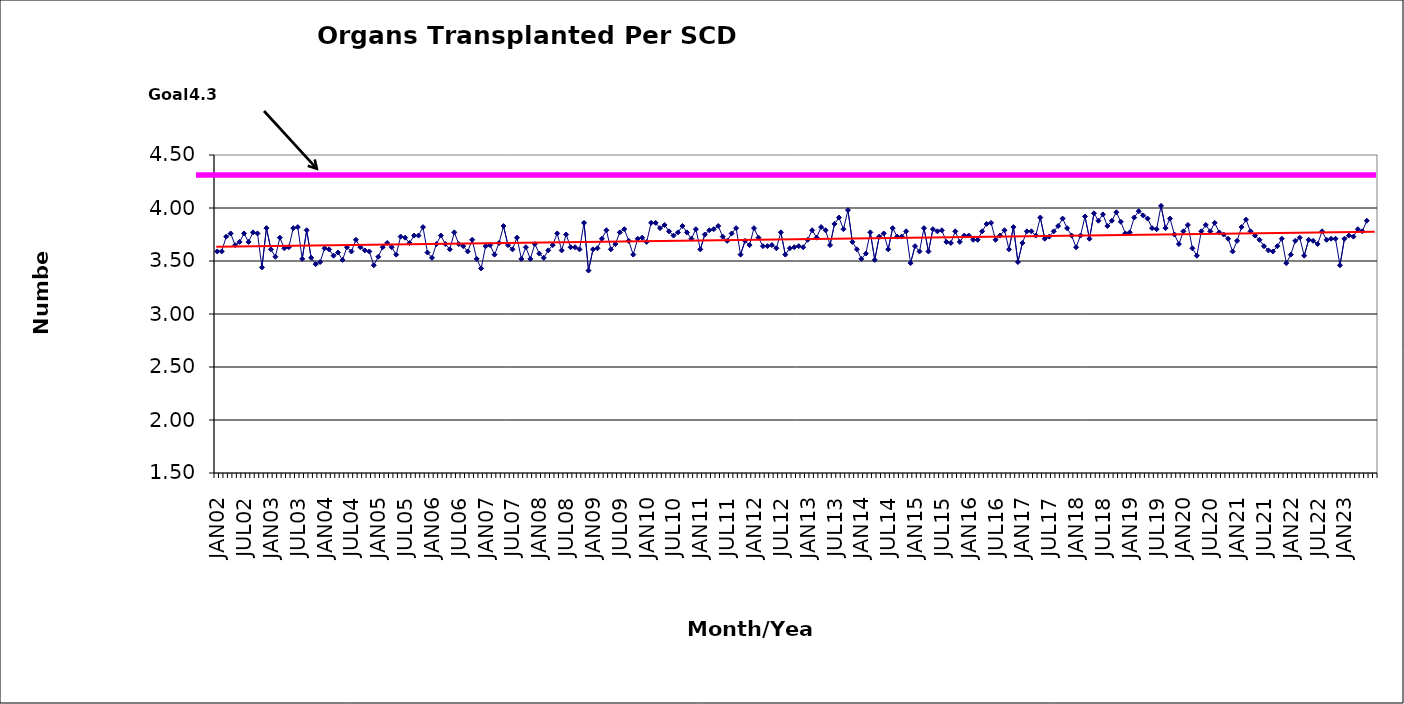
| Category | Series 0 |
|---|---|
| JAN02 | 3.59 |
| FEB02 | 3.59 |
| MAR02 | 3.73 |
| APR02 | 3.76 |
| MAY02 | 3.65 |
| JUN02 | 3.68 |
| JUL02 | 3.76 |
| AUG02 | 3.68 |
| SEP02 | 3.77 |
| OCT02 | 3.76 |
| NOV02 | 3.44 |
| DEC02 | 3.81 |
| JAN03 | 3.61 |
| FEB03 | 3.54 |
| MAR03 | 3.72 |
| APR03 | 3.62 |
| MAY03 | 3.63 |
| JUN03 | 3.81 |
| JUL03 | 3.82 |
| AUG03 | 3.52 |
| SEP03 | 3.79 |
| OCT03 | 3.53 |
| NOV03 | 3.47 |
| DEC03 | 3.49 |
| JAN04 | 3.62 |
| FEB04 | 3.61 |
| MAR04 | 3.55 |
| APR04 | 3.58 |
| MAY04 | 3.51 |
| JUN04 | 3.63 |
| JUL04 | 3.59 |
| AUG04 | 3.7 |
| SEP04 | 3.63 |
| OCT04 | 3.6 |
| NOV04 | 3.59 |
| DEC04 | 3.46 |
| JAN05 | 3.54 |
| FEB05 | 3.63 |
| MAR05 | 3.67 |
| APR05 | 3.63 |
| MAY05 | 3.56 |
| JUN05 | 3.73 |
| JUL05 | 3.72 |
| AUG05 | 3.67 |
| SEP05 | 3.74 |
| OCT05 | 3.74 |
| NOV05 | 3.82 |
| DEC05 | 3.58 |
| JAN06 | 3.53 |
| FEB06 | 3.66 |
| MAR06 | 3.74 |
| APR06 | 3.66 |
| MAY06 | 3.61 |
| JUN06 | 3.77 |
| JUL06 | 3.66 |
| AUG06 | 3.64 |
| SEP06 | 3.59 |
| OCT06 | 3.7 |
| NOV06 | 3.52 |
| DEC06 | 3.43 |
| JAN07 | 3.64 |
| FEB07 | 3.65 |
| MAR07 | 3.56 |
| APR07 | 3.67 |
| MAY07 | 3.83 |
| JUN07 | 3.65 |
| JUL07 | 3.61 |
| AUG07 | 3.72 |
| SEP07 | 3.52 |
| OCT07 | 3.63 |
| NOV07 | 3.52 |
| DEC07 | 3.66 |
| JAN08 | 3.57 |
| FEB08 | 3.53 |
| MAR08 | 3.6 |
| APR08 | 3.65 |
| MAY08 | 3.76 |
| JUN08 | 3.6 |
| JUL08 | 3.75 |
| AUG08 | 3.63 |
| SEP08 | 3.63 |
| OCT08 | 3.61 |
| NOV08 | 3.86 |
| DEC08 | 3.41 |
| JAN09 | 3.61 |
| FEB09 | 3.62 |
| MAR09 | 3.71 |
| APR09 | 3.79 |
| MAY09 | 3.61 |
| JUN09 | 3.66 |
| JUL09 | 3.77 |
| AUG09 | 3.8 |
| SEP09 | 3.69 |
| OCT09 | 3.56 |
| NOV09 | 3.71 |
| DEC09 | 3.72 |
| JAN10 | 3.68 |
| FEB10 | 3.86 |
| MAR10 | 3.86 |
| APR10 | 3.81 |
| MAY10 | 3.84 |
| JUN10 | 3.78 |
| JUL10 | 3.74 |
| AUG10 | 3.77 |
| SEP10 | 3.83 |
| OCT10 | 3.77 |
| NOV10 | 3.71 |
| DEC10 | 3.8 |
| JAN11 | 3.61 |
| FEB11 | 3.75 |
| MAR11 | 3.79 |
| APR11 | 3.8 |
| MAY11 | 3.83 |
| JUN11 | 3.73 |
| JUL11 | 3.69 |
| AUG11 | 3.76 |
| SEP11 | 3.81 |
| OCT11 | 3.56 |
| NOV11 | 3.69 |
| DEC11 | 3.65 |
| JAN12 | 3.81 |
| FEB12 | 3.72 |
| MAR12 | 3.64 |
| APR12 | 3.64 |
| MAY12 | 3.65 |
| JUN12 | 3.62 |
| JUL12 | 3.77 |
| AUG12 | 3.56 |
| SEP12 | 3.62 |
| OCT12 | 3.63 |
| NOV12 | 3.64 |
| DEC12 | 3.63 |
| JAN13 | 3.7 |
| FEB13 | 3.79 |
| MAR13 | 3.72 |
| APR13 | 3.82 |
| MAY13 | 3.79 |
| JUN13 | 3.65 |
| JUL13 | 3.85 |
| AUG13 | 3.91 |
| SEP13 | 3.8 |
| OCT13 | 3.98 |
| NOV13 | 3.68 |
| DEC13 | 3.61 |
| JAN14 | 3.52 |
| FEB14 | 3.57 |
| MAR14 | 3.77 |
| APR14 | 3.51 |
| MAY14 | 3.73 |
| JUN14 | 3.76 |
| JUL14 | 3.61 |
| AUG14 | 3.81 |
| SEP14 | 3.73 |
| OCT14 | 3.73 |
| NOV14 | 3.78 |
| DEC14 | 3.48 |
| JAN15 | 3.64 |
| FEB15 | 3.59 |
| MAR15 | 3.81 |
| APR15 | 3.59 |
| MAY15 | 3.8 |
| JUN15 | 3.78 |
| JUL15 | 3.79 |
| AUG15 | 3.68 |
| SEP15 | 3.67 |
| OCT15 | 3.78 |
| NOV15 | 3.68 |
| DEC15 | 3.74 |
| JAN16 | 3.74 |
| FEB16 | 3.7 |
| MAR16 | 3.7 |
| APR16 | 3.78 |
| MAY16 | 3.85 |
| JUN16 | 3.86 |
| JUL16 | 3.7 |
| AUG16 | 3.74 |
| SEP16 | 3.79 |
| OCT16 | 3.61 |
| NOV16 | 3.82 |
| DEC16 | 3.49 |
| JAN17 | 3.67 |
| FEB17 | 3.78 |
| MAR17 | 3.78 |
| APR17 | 3.74 |
| MAY17 | 3.91 |
| JUN17 | 3.71 |
| JUL17 | 3.73 |
| AUG17 | 3.78 |
| SEP17 | 3.83 |
| OCT17 | 3.9 |
| NOV17 | 3.81 |
| DEC17 | 3.74 |
| JAN18 | 3.63 |
| FEB18 | 3.74 |
| MAR18 | 3.92 |
| APR18 | 3.71 |
| MAY18 | 3.95 |
| JUN18 | 3.88 |
| JUL18 | 3.94 |
| AUG18 | 3.83 |
| SEP18 | 3.88 |
| OCT18 | 3.96 |
| NOV18 | 3.87 |
| DEC18 | 3.76 |
| JAN19 | 3.77 |
| FEB19 | 3.91 |
| MAR19 | 3.97 |
| APR19 | 3.93 |
| MAY19 | 3.9 |
| JUN19 | 3.81 |
| JUL19 | 3.8 |
| AUG19 | 4.02 |
| SEP19 | 3.81 |
| OCT19 | 3.9 |
| NOV19 | 3.75 |
| DEC19 | 3.66 |
| JAN20 | 3.78 |
| FEB20 | 3.84 |
| MAR20 | 3.62 |
| APR20 | 3.55 |
| MAY20 | 3.78 |
| JUN20 | 3.84 |
| JUL20 | 3.78 |
| AUG20 | 3.86 |
| SEP20 | 3.77 |
| OCT20 | 3.75 |
| NOV20 | 3.71 |
| DEC20 | 3.59 |
| JAN21 | 3.69 |
| FEB21 | 3.82 |
| MAR21 | 3.89 |
| APR21 | 3.78 |
| MAY21 | 3.74 |
| JUN21 | 3.7 |
| JUL21 | 3.64 |
| AUG21 | 3.6 |
| SEP21 | 3.59 |
| OCT21 | 3.64 |
| NOV21 | 3.71 |
| DEC21 | 3.48 |
| JAN22 | 3.56 |
| FEB22 | 3.69 |
| MAR22 | 3.72 |
| APR22 | 3.55 |
| MAY22 | 3.7 |
| JUN22 | 3.69 |
| JUL22 | 3.66 |
| AUG22 | 3.78 |
| SEP22 | 3.7 |
| OCT22 | 3.71 |
| NOV22 | 3.71 |
| DEC22 | 3.46 |
| JAN23 | 3.71 |
| FEB23 | 3.74 |
| MAR23 | 3.73 |
| APR23 | 3.8 |
| MAY23 | 3.78 |
| JUN23 | 3.88 |